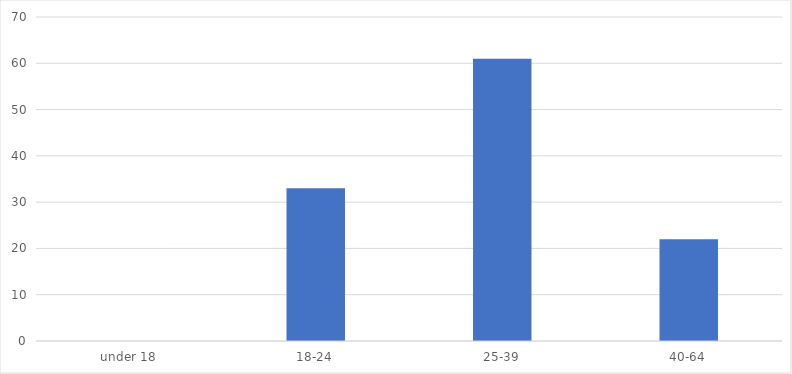
| Category | Number of Responses |
|---|---|
| under 18 | 0 |
| 18-24 | 33 |
| 25-39 | 61 |
| 40-64 | 22 |